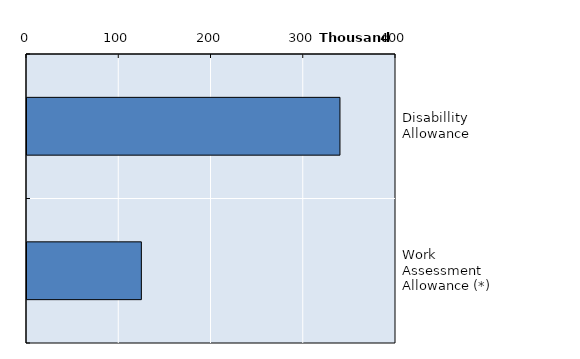
| Category | Series 0 |
|---|---|
| Disabillity Allowance | 339245 |
| Work Assessment Allowance (*) | 123968 |